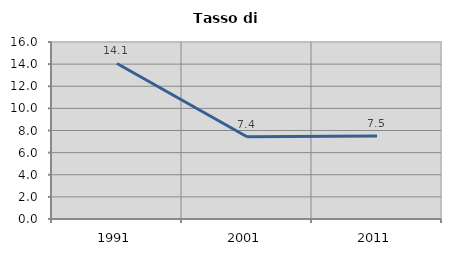
| Category | Tasso di disoccupazione   |
|---|---|
| 1991.0 | 14.059 |
| 2001.0 | 7.441 |
| 2011.0 | 7.512 |